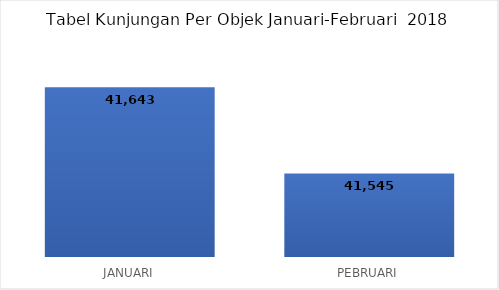
| Category |  41,643  |
|---|---|
| JANUARI | 41643 |
| PEBRUARI | 41545 |